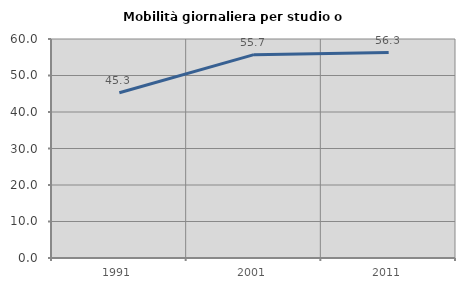
| Category | Mobilità giornaliera per studio o lavoro |
|---|---|
| 1991.0 | 45.26 |
| 2001.0 | 55.712 |
| 2011.0 | 56.291 |